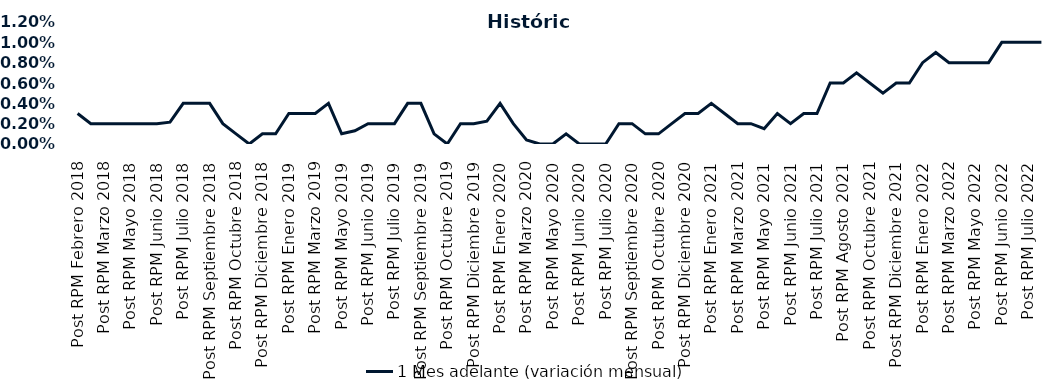
| Category | 1 Mes adelante (variación mensual) |
|---|---|
| Post RPM Febrero 2018 | 0.003 |
| Pre RPM Marzo 2018 | 0.002 |
| Post RPM Marzo 2018 | 0.002 |
| Pre RPM Mayo 2018 | 0.002 |
| Post RPM Mayo 2018 | 0.002 |
| Pre RPM Junio 2018 | 0.002 |
| Post RPM Junio 2018 | 0.002 |
| Pre RPM Julio 2018 | 0.002 |
| Post RPM Julio 2018 | 0.004 |
| Pre RPM Septiembre 2018 | 0.004 |
| Post RPM Septiembre 2018 | 0.004 |
| Pre RPM Octubre 2018 | 0.002 |
| Post RPM Octubre 2018 | 0.001 |
| Pre RPM Diciembre 2018 | 0 |
| Post RPM Diciembre 2018 | 0.001 |
| Pre RPM Enero 2019 | 0.001 |
| Post RPM Enero 2019 | 0.003 |
| Pre RPM Marzo 2019 | 0.003 |
| Post RPM Marzo 2019 | 0.003 |
| Pre RPM Mayo 2019 | 0.004 |
| Post RPM Mayo 2019 | 0.001 |
| Pre RPM Junio 2019 | 0.001 |
| Post RPM Junio 2019 | 0.002 |
| Pre RPM Julio 2019 | 0.002 |
| Post RPM Julio 2019 | 0.002 |
| Pre RPM Septiembre 2019 | 0.004 |
| Post RPM Septiembre 2019 | 0.004 |
| Pre RPM Octubre 2019 | 0.001 |
| Post RPM Octubre 2019 | 0 |
| Pre RPM Diciembre 2019 | 0.002 |
| Post RPM Diciembre 2019 | 0.002 |
| Pre RPM Enero 2020 | 0.002 |
| Post RPM Enero 2020 | 0.004 |
| Pre RPM Marzo 2020 | 0.002 |
| Post RPM Marzo 2020 | 0 |
| Pre RPM Mayo 2020 | 0 |
| Post RPM Mayo 2020 | 0 |
| Pre RPM Junio 2020 | 0.001 |
| Post RPM Junio 2020 | 0 |
| Pre RPM Julio 2020 | 0 |
| Post RPM Julio 2020 | 0 |
| Pre RPM Septiembre 2020 | 0.002 |
| Post RPM Septiembre 2020 | 0.002 |
| Pre RPM Octubre 2020 | 0.001 |
| Post RPM Octubre 2020 | 0.001 |
| Pre RPM Diciembre 2020 | 0.002 |
| Post RPM Diciembre 2020 | 0.003 |
| Pre RPM Enero 2021 | 0.003 |
| Post RPM Enero 2021 | 0.004 |
| Pre RPM Marzo 2021 | 0.003 |
| Post RPM Marzo 2021 | 0.002 |
| Pre RPM Mayo 2021 | 0.002 |
| Post RPM Mayo 2021 | 0.002 |
| Pre RPM Junio 2021 | 0.003 |
| Post RPM Junio 2021 | 0.002 |
| Pre RPM Julio 2021 | 0.003 |
| Post RPM Julio 2021 | 0.003 |
| Pre RPM Agosto 2021 | 0.006 |
| Post RPM Agosto 2021 | 0.006 |
| Pre RPM Octubre 2021 | 0.007 |
| Post RPM Octubre 2021 | 0.006 |
| Pre RPM Diciembre 2021 | 0.005 |
| Post RPM Diciembre 2021 | 0.006 |
| Pre RPM Enero 2022 | 0.006 |
| Post RPM Enero 2022 | 0.008 |
| Pre RPM Marzo 2022 | 0.009 |
| Post RPM Marzo 2022 | 0.008 |
| Pre RPM Mayo 2022 | 0.008 |
| Post RPM Mayo 2022 | 0.008 |
| Pre RPM Junio 2022 | 0.008 |
| Post RPM Junio 2022 | 0.01 |
| Pre RPM Julio 2022 | 0.01 |
| Post RPM Julio 2022 | 0.01 |
| Pre RPM Septiembre 2022 | 0.01 |